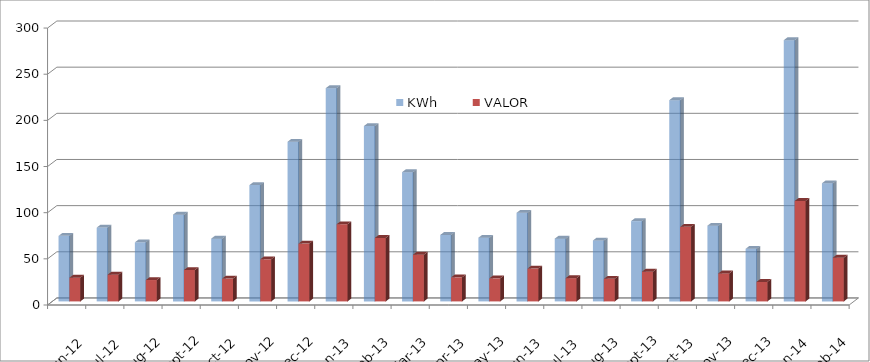
| Category | KWh | VALOR |
|---|---|---|
| 2012-06-01 | 71 | 25.69 |
| 2012-07-01 | 80 | 28.95 |
| 2012-08-01 | 64 | 23.16 |
| 2012-09-01 | 94 | 34.01 |
| 2012-10-01 | 68 | 24.69 |
| 2012-11-01 | 126 | 45.59 |
| 2012-12-01 | 173 | 62.61 |
| 2013-01-01 | 231 | 83.59 |
| 2013-02-01 | 190 | 68.75 |
| 2013-03-01 | 140 | 50.66 |
| 2013-04-01 | 72 | 26.05 |
| 2013-05-01 | 69 | 24.96 |
| 2013-06-01 | 96 | 35.56 |
| 2013-07-01 | 68 | 25.19 |
| 2013-08-01 | 66 | 24.45 |
| 2013-09-01 | 87 | 32.23 |
| 2013-10-01 | 218 | 80.76 |
| 2013-11-01 | 82 | 30.37 |
| 2013-12-01 | 57 | 21.11 |
| 2014-01-01 | 283 | 108.84 |
| 2014-02-01 | 128 | 47.42 |